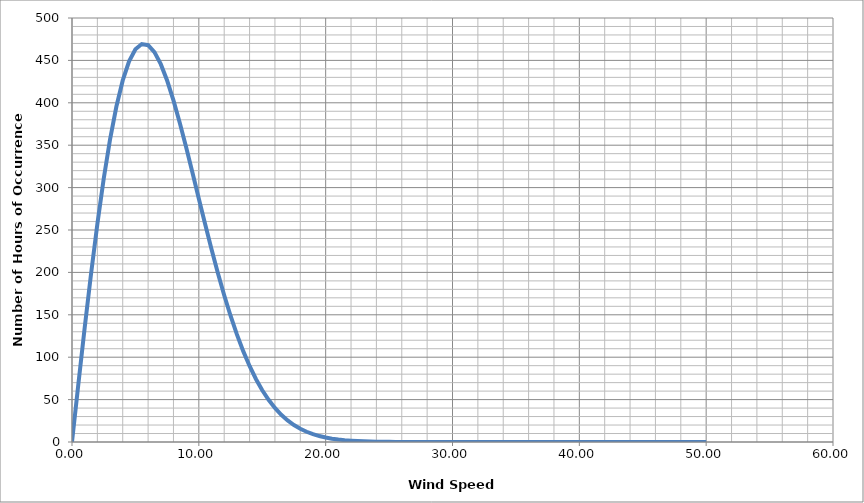
| Category | Weibull |
|---|---|
| 0.0 | 0 |
| 0.5 | 68.171 |
| 1.0 | 134.753 |
| 1.5 | 198.22 |
| 2.0 | 257.164 |
| 2.5 | 310.351 |
| 3.0 | 356.757 |
| 3.5 | 395.608 |
| 4.0 | 426.393 |
| 4.5 | 448.873 |
| 5.0 | 463.071 |
| 5.5 | 469.261 |
| 6.0 | 467.934 |
| 6.5 | 459.764 |
| 7.0 | 445.57 |
| 7.5 | 426.267 |
| 8.0 | 402.828 |
| 8.5 | 376.24 |
| 9.0 | 347.466 |
| 9.5 | 317.413 |
| 10.0 | 286.906 |
| 10.5 | 256.669 |
| 11.0 | 227.315 |
| 11.5 | 199.339 |
| 12.0 | 173.118 |
| 12.5 | 148.917 |
| 13.0 | 126.899 |
| 13.5 | 107.136 |
| 14.0 | 89.624 |
| 14.5 | 74.296 |
| 15.0 | 61.038 |
| 15.5 | 49.7 |
| 16.0 | 40.111 |
| 16.5 | 32.089 |
| 17.0 | 25.448 |
| 17.5 | 20.008 |
| 18.0 | 15.595 |
| 18.5 | 12.051 |
| 19.0 | 9.234 |
| 19.5 | 7.015 |
| 20.0 | 5.285 |
| 20.5 | 3.948 |
| 21.0 | 2.924 |
| 21.5 | 2.148 |
| 22.0 | 1.565 |
| 22.5 | 1.13 |
| 23.0 | 0.81 |
| 23.5 | 0.575 |
| 24.0 | 0.405 |
| 24.5 | 0.283 |
| 25.0 | 0.196 |
| 25.5 | 0.135 |
| 26.0 | 0.092 |
| 26.5 | 0.062 |
| 27.0 | 0.042 |
| 27.5 | 0.028 |
| 28.0 | 0.018 |
| 28.5 | 0.012 |
| 29.0 | 0.008 |
| 29.5 | 0.005 |
| 30.0 | 0.003 |
| 30.5 | 0.002 |
| 31.0 | 0.001 |
| 31.5 | 0.001 |
| 32.0 | 0 |
| 32.5 | 0 |
| 33.0 | 0 |
| 33.5 | 0 |
| 34.0 | 0 |
| 34.5 | 0 |
| 35.0 | 0 |
| 35.5 | 0 |
| 36.0 | 0 |
| 36.5 | 0 |
| 37.0 | 0 |
| 37.5 | 0 |
| 38.0 | 0 |
| 38.5 | 0 |
| 39.0 | 0 |
| 39.5 | 0 |
| 40.0 | 0 |
| 40.5 | 0 |
| 41.0 | 0 |
| 41.5 | 0 |
| 42.0 | 0 |
| 42.5 | 0 |
| 43.0 | 0 |
| 43.5 | 0 |
| 44.0 | 0 |
| 44.5 | 0 |
| 45.0 | 0 |
| 45.5 | 0 |
| 46.0 | 0 |
| 46.5 | 0 |
| 47.0 | 0 |
| 47.5 | 0 |
| 48.0 | 0 |
| 48.5 | 0 |
| 49.0 | 0 |
| 49.5 | 0 |
| 50.0 | 0 |